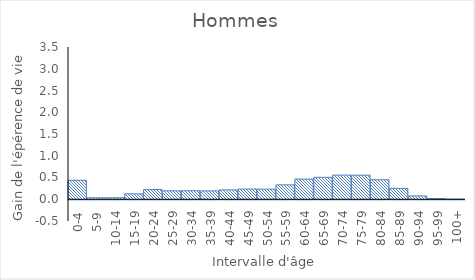
| Category | Hommes |
|---|---|
| 0-4 | 0.436 |
| 5-9 | 0.033 |
| 10-14 | 0.034 |
| 15-19 | 0.125 |
| 20-24 | 0.223 |
| 25-29 | 0.193 |
| 30-34 | 0.195 |
| 35-39 | 0.193 |
| 40-44 | 0.214 |
| 45-49 | 0.234 |
| 50-54 | 0.232 |
| 55-59 | 0.331 |
| 60-64 | 0.464 |
| 65-69 | 0.504 |
| 70-74 | 0.556 |
| 75-79 | 0.554 |
| 80-84 | 0.449 |
| 85-89 | 0.25 |
| 90-94 | 0.076 |
| 95-99 | 0.014 |
| 100+ | 0.001 |